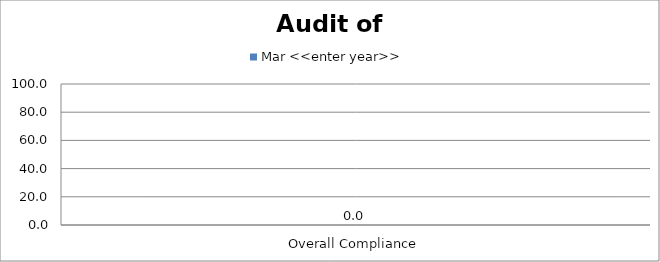
| Category | Mar <<enter year>> |
|---|---|
| Overall Compliance | 0 |